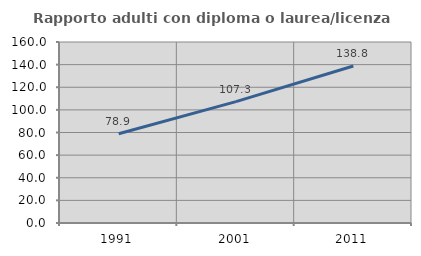
| Category | Rapporto adulti con diploma o laurea/licenza media  |
|---|---|
| 1991.0 | 78.899 |
| 2001.0 | 107.317 |
| 2011.0 | 138.776 |